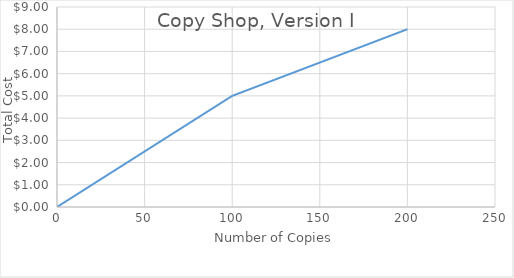
| Category | C(n)= Total cost |
|---|---|
| 0.0 | 0 |
| 2.0 | 0.1 |
| 4.0 | 0.2 |
| 6.0 | 0.3 |
| 8.0 | 0.4 |
| 10.0 | 0.5 |
| 12.0 | 0.6 |
| 14.0 | 0.7 |
| 16.0 | 0.8 |
| 18.0 | 0.9 |
| 20.0 | 1 |
| 22.0 | 1.1 |
| 24.0 | 1.2 |
| 26.0 | 1.3 |
| 28.0 | 1.4 |
| 30.0 | 1.5 |
| 32.0 | 1.6 |
| 34.0 | 1.7 |
| 36.0 | 1.8 |
| 38.0 | 1.9 |
| 40.0 | 2 |
| 42.0 | 2.1 |
| 44.0 | 2.2 |
| 46.0 | 2.3 |
| 48.0 | 2.4 |
| 50.0 | 2.5 |
| 52.0 | 2.6 |
| 54.0 | 2.7 |
| 56.0 | 2.8 |
| 58.0 | 2.9 |
| 60.0 | 3 |
| 62.0 | 3.1 |
| 64.0 | 3.2 |
| 66.0 | 3.3 |
| 68.0 | 3.4 |
| 70.0 | 3.5 |
| 72.0 | 3.6 |
| 74.0 | 3.7 |
| 76.0 | 3.8 |
| 78.0 | 3.9 |
| 80.0 | 4 |
| 82.0 | 4.1 |
| 84.0 | 4.2 |
| 86.0 | 4.3 |
| 88.0 | 4.4 |
| 90.0 | 4.5 |
| 92.0 | 4.6 |
| 94.0 | 4.7 |
| 96.0 | 4.8 |
| 98.0 | 4.9 |
| 100.0 | 5 |
| 102.0 | 5.06 |
| 104.0 | 5.12 |
| 106.0 | 5.18 |
| 108.0 | 5.24 |
| 110.0 | 5.3 |
| 112.0 | 5.36 |
| 114.0 | 5.42 |
| 116.0 | 5.48 |
| 118.0 | 5.54 |
| 120.0 | 5.6 |
| 122.0 | 5.66 |
| 124.0 | 5.72 |
| 126.0 | 5.78 |
| 128.0 | 5.84 |
| 130.0 | 5.9 |
| 132.0 | 5.96 |
| 134.0 | 6.02 |
| 136.0 | 6.08 |
| 138.0 | 6.14 |
| 140.0 | 6.2 |
| 142.0 | 6.26 |
| 144.0 | 6.32 |
| 146.0 | 6.38 |
| 148.0 | 6.44 |
| 150.0 | 6.5 |
| 152.0 | 6.56 |
| 154.0 | 6.62 |
| 156.0 | 6.68 |
| 158.0 | 6.74 |
| 160.0 | 6.8 |
| 162.0 | 6.86 |
| 164.0 | 6.92 |
| 166.0 | 6.98 |
| 168.0 | 7.04 |
| 170.0 | 7.1 |
| 172.0 | 7.16 |
| 174.0 | 7.22 |
| 176.0 | 7.28 |
| 178.0 | 7.34 |
| 180.0 | 7.4 |
| 182.0 | 7.46 |
| 184.0 | 7.52 |
| 186.0 | 7.58 |
| 188.0 | 7.64 |
| 190.0 | 7.7 |
| 192.0 | 7.76 |
| 194.0 | 7.82 |
| 196.0 | 7.88 |
| 198.0 | 7.94 |
| 200.0 | 8 |